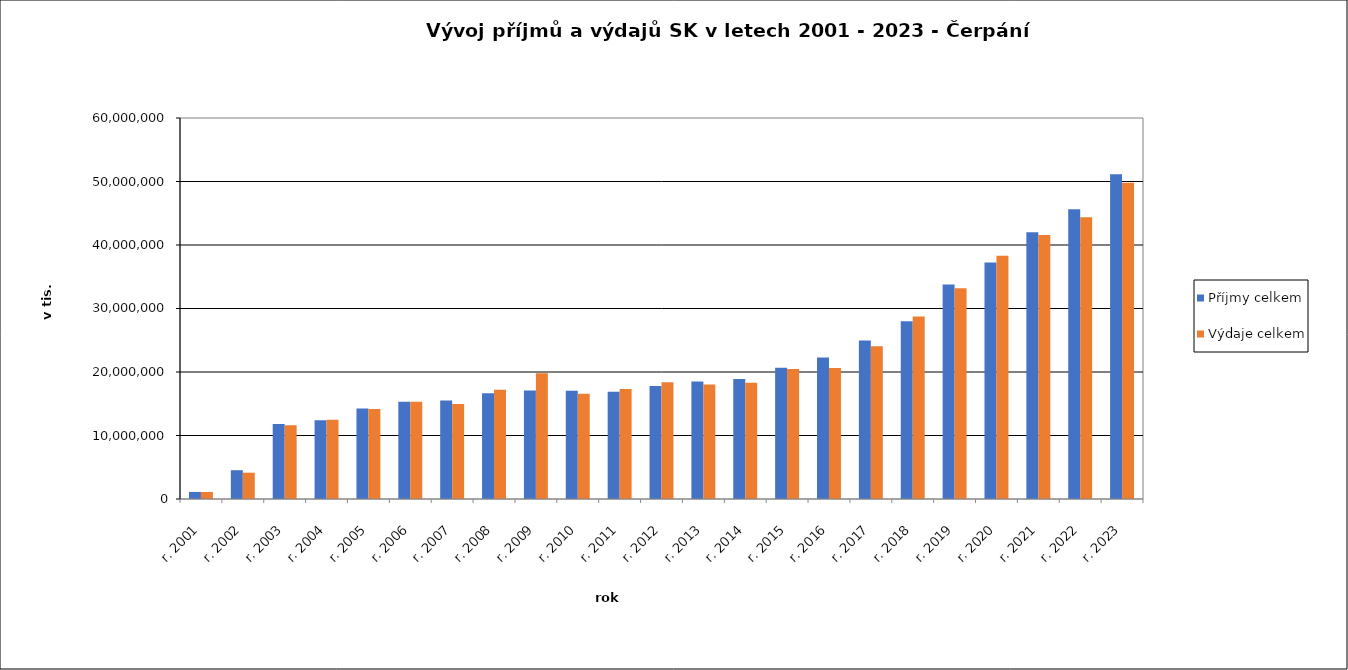
| Category | Příjmy celkem | Výdaje celkem |
|---|---|---|
| r. 2001 | 1115529.22 | 1099064 |
| r. 2002 | 4535027.72 | 4144437 |
| r. 2003 | 11806313.6 | 11614978 |
| r. 2004 | 12420786.03 | 12461415 |
| r. 2005 | 14243082.17 | 14177154 |
| r. 2006 | 15309625.07 | 15300333 |
| r. 2007 | 15498148 | 14959975 |
| r. 2008 | 16667794 | 17191235 |
| r. 2009 | 17073719 | 19784783.26 |
| r. 2010 | 17042556 | 16568990 |
| r. 2011 | 16896455 | 17337895 |
| r. 2012 | 17781485 | 18402032 |
| r. 2013 | 18500434 | 18044742 |
| r. 2014 | 18879799 | 18318773 |
| r. 2015 | 20669683 | 20472479 |
| r. 2016 | 22296375 | 20614905 |
| r. 2017 | 24945773 | 24052460 |
| r. 2018 | 27977516 | 28744720 |
| r. 2019 | 33783976 | 33186814 |
| r. 2020 | 37226463 | 38297731 |
| r. 2021 | 42024311 | 41570700.9 |
| r. 2022 | 45633534 | 44372443 |
| r. 2023 | 51128199 | 49786513 |